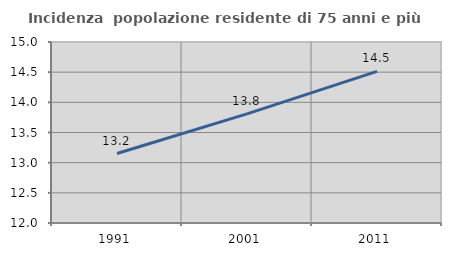
| Category | Incidenza  popolazione residente di 75 anni e più |
|---|---|
| 1991.0 | 13.151 |
| 2001.0 | 13.81 |
| 2011.0 | 14.512 |